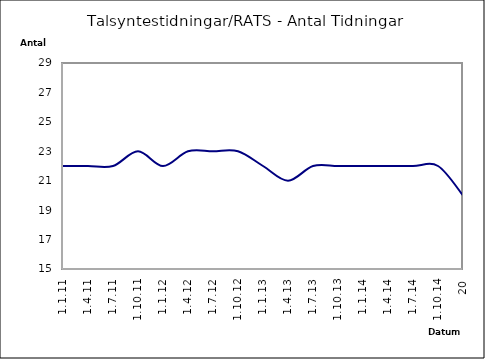
| Category | Series 0 |
|---|---|
| 1.1.11 | 22 |
| 1.4.11 | 22 |
| 1.7.11 | 22 |
| 1.10.11 | 23 |
| 1.1.12 | 22 |
| 1.4.12 | 23 |
| 1.7.12 | 23 |
| 1.10.12 | 23 |
| 1.1.13 | 22 |
| 1.4.13 | 21 |
| 1.7.13 | 22 |
| 1.10.13 | 22 |
| 1.1.14 | 22 |
| 1.4.14 | 22 |
| 1.7.14 | 22 |
| 1.10.14 | 22 |
| 20 | 20 |